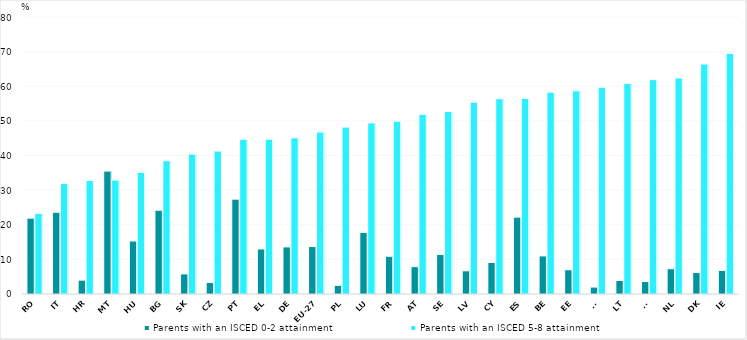
| Category | Parents with an ISCED 0-2 attainment | Parents with an ISCED 5-8 attainment |
|---|---|---|
| RO | 21.9 | 23.3 |
| IT | 23.6 | 31.9 |
| HR | 4 | 32.8 |
| MT | 35.5 | 32.9 |
| HU | 15.3 | 35.1 |
| BG | 24.2 | 38.5 |
| SK | 5.8 | 40.4 |
| CZ | 3.3 | 41.3 |
| PT | 27.4 | 44.7 |
| EL | 13 | 44.7 |
| DE | 13.6 | 45.1 |
| EU-27 | 13.7 | 46.8 |
| PL | 2.5 | 48.2 |
| LU | 17.8 | 49.4 |
| FR | 10.9 | 49.9 |
| AT | 7.9 | 51.9 |
| SE | 11.4 | 52.7 |
| LV | 6.7 | 55.4 |
| CY | 9.1 | 56.4 |
| ES | 22.2 | 56.5 |
| BE | 11 | 58.3 |
| EE | 7 | 58.7 |
| SI | 2 | 59.7 |
| LT | 3.9 | 60.8 |
| FI | 3.6 | 61.9 |
| NL | 7.3 | 62.4 |
| DK | 6.2 | 66.4 |
| IE | 6.8 | 69.5 |